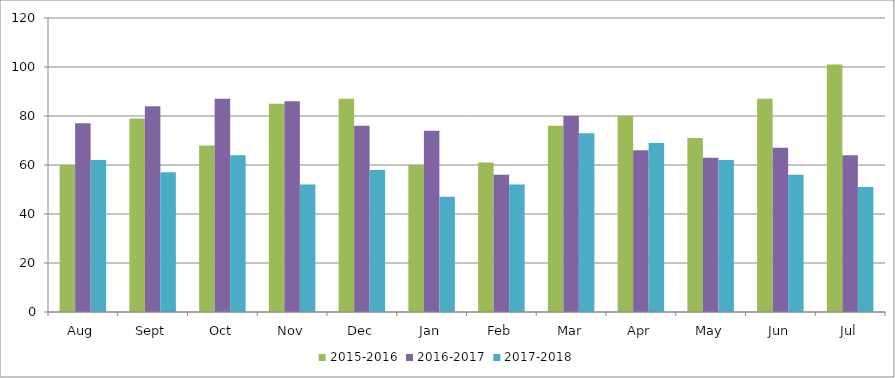
| Category | 2015-2016 | 2016-2017 | 2017-2018 |
|---|---|---|---|
| Aug | 60 | 77 | 62 |
| Sept | 79 | 84 | 57 |
| Oct | 68 | 87 | 64 |
| Nov | 85 | 86 | 52 |
| Dec | 87 | 76 | 58 |
| Jan | 60 | 74 | 47 |
| Feb | 61 | 56 | 52 |
| Mar | 76 | 80 | 73 |
| Apr | 80 | 66 | 69 |
| May | 71 | 63 | 62 |
| Jun | 87 | 67 | 56 |
| Jul | 101 | 64 | 51 |